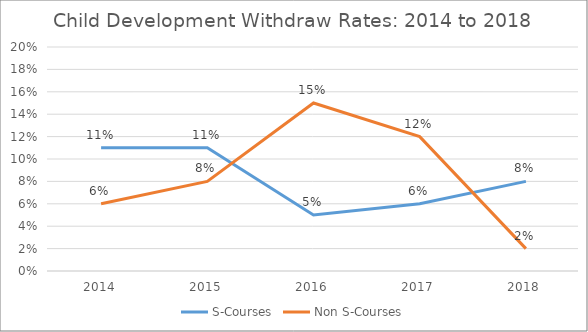
| Category | S-Courses | Non S-Courses |
|---|---|---|
| 2014.0 | 0.11 | 0.06 |
| 2015.0 | 0.11 | 0.08 |
| 2016.0 | 0.05 | 0.15 |
| 2017.0 | 0.06 | 0.12 |
| 2018.0 | 0.08 | 0.02 |